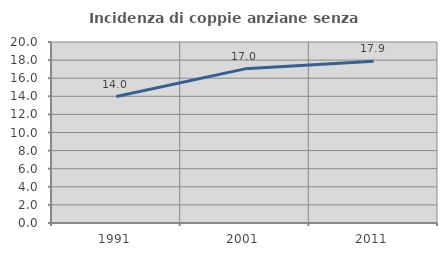
| Category | Incidenza di coppie anziane senza figli  |
|---|---|
| 1991.0 | 13.97 |
| 2001.0 | 17.031 |
| 2011.0 | 17.867 |